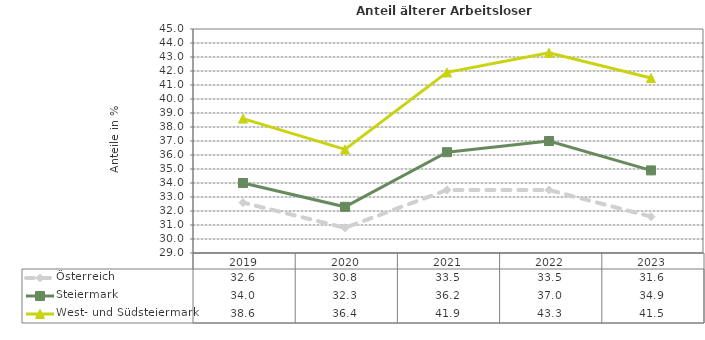
| Category | Österreich | Steiermark | West- und Südsteiermark |
|---|---|---|---|
| 2023.0 | 31.6 | 34.9 | 41.5 |
| 2022.0 | 33.5 | 37 | 43.3 |
| 2021.0 | 33.5 | 36.2 | 41.9 |
| 2020.0 | 30.8 | 32.3 | 36.4 |
| 2019.0 | 32.6 | 34 | 38.6 |